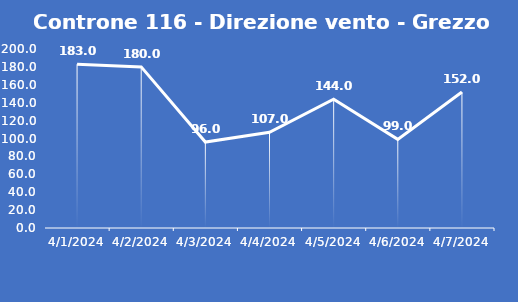
| Category | Controne 116 - Direzione vento - Grezzo (°N) |
|---|---|
| 4/1/24 | 183 |
| 4/2/24 | 180 |
| 4/3/24 | 96 |
| 4/4/24 | 107 |
| 4/5/24 | 144 |
| 4/6/24 | 99 |
| 4/7/24 | 152 |